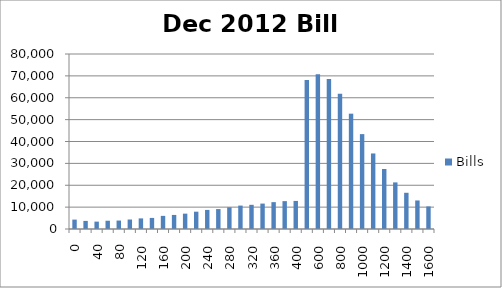
| Category | Bills |
|---|---|
| 0.0 | 4297.08 |
| 20.0 | 3696.46 |
| 40.0 | 3369.756 |
| 60.0 | 3780.895 |
| 80.0 | 3864.393 |
| 100.0 | 4333.19 |
| 120.0 | 4849.822 |
| 140.0 | 5065.636 |
| 160.0 | 6000.637 |
| 180.0 | 6425.218 |
| 200.0 | 7019.32 |
| 220.0 | 7914.727 |
| 240.0 | 8725.038 |
| 260.0 | 9109.823 |
| 280.0 | 9910.1 |
| 300.0 | 10710.731 |
| 320.0 | 11054.514 |
| 340.0 | 11618.384 |
| 360.0 | 12279.777 |
| 380.0 | 12738.664 |
| 400.0 | 12831.704 |
| 500.0 | 68162.682 |
| 600.0 | 70786.796 |
| 700.0 | 68532.019 |
| 800.0 | 61843.454 |
| 900.0 | 52719.579 |
| 1000.0 | 43378.108 |
| 1100.0 | 34534.927 |
| 1200.0 | 27436.215 |
| 1300.0 | 21301.736 |
| 1400.0 | 16553.537 |
| 1500.0 | 13047.184 |
| 1600.0 | 10316.523 |